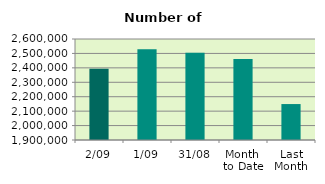
| Category | Series 0 |
|---|---|
| 2/09 | 2394540 |
| 1/09 | 2529370 |
| 31/08 | 2505372 |
| Month 
to Date | 2461955 |
| Last
Month | 2149140 |